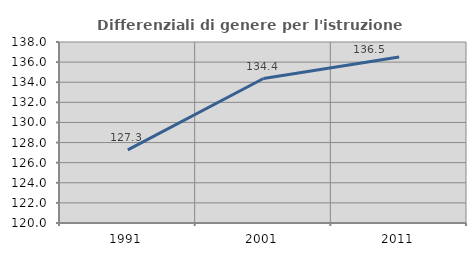
| Category | Differenziali di genere per l'istruzione superiore |
|---|---|
| 1991.0 | 127.273 |
| 2001.0 | 134.366 |
| 2011.0 | 136.513 |